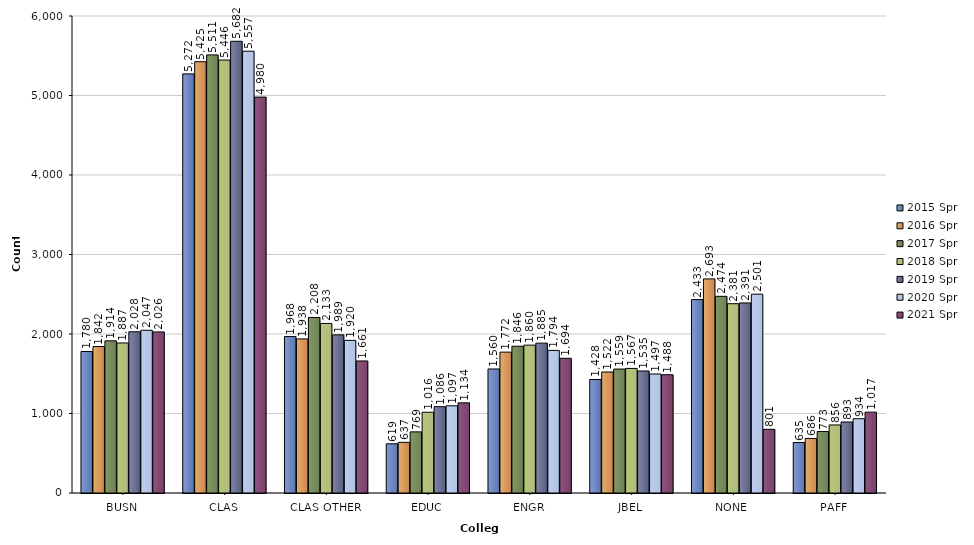
| Category | 2015 Spr | 2016 Spr | 2017 Spr | 2018 Spr | 2019 Spr | 2020 Spr | 2021 Spr |
|---|---|---|---|---|---|---|---|
| BUSN | 1780 | 1842 | 1914 | 1887 | 2028 | 2047 | 2026 |
| CLAS | 5272 | 5425 | 5511 | 5446 | 5682 | 5557 | 4980 |
| CLAS OTHER | 1968 | 1938 | 2208 | 2133 | 1989 | 1920 | 1661 |
| EDUC | 619 | 637 | 769 | 1016 | 1086 | 1097 | 1134 |
| ENGR | 1560 | 1772 | 1846 | 1860 | 1885 | 1794 | 1694 |
| JBEL | 1428 | 1522 | 1559 | 1567 | 1535 | 1497 | 1488 |
| NONE | 2433 | 2693 | 2474 | 2381 | 2391 | 2501 | 801 |
| PAFF | 635 | 686 | 773 | 856 | 893 | 934 | 1017 |